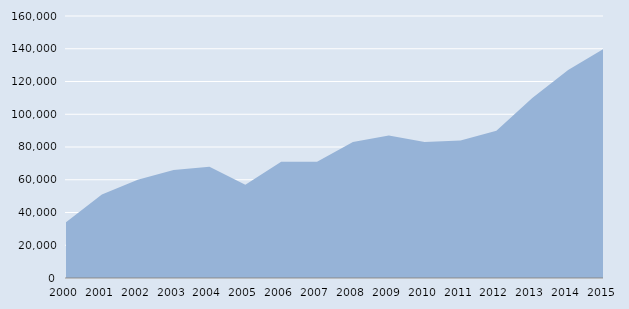
| Category | Series 0 |
|---|---|
| 2000.0 | 34000 |
| 2001.0 | 51000 |
| 2002.0 | 60000 |
| 2003.0 | 66000 |
| 2004.0 | 68000 |
| 2005.0 | 57000 |
| 2006.0 | 71000 |
| 2007.0 | 71000 |
| 2008.0 | 83000 |
| 2009.0 | 87000 |
| 2010.0 | 83000 |
| 2011.0 | 84000 |
| 2012.0 | 90000 |
| 2013.0 | 110000 |
| 2014.0 | 127000 |
| 2015.0 | 140000 |